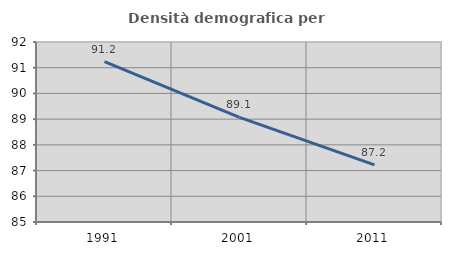
| Category | Densità demografica |
|---|---|
| 1991.0 | 91.234 |
| 2001.0 | 89.071 |
| 2011.0 | 87.222 |